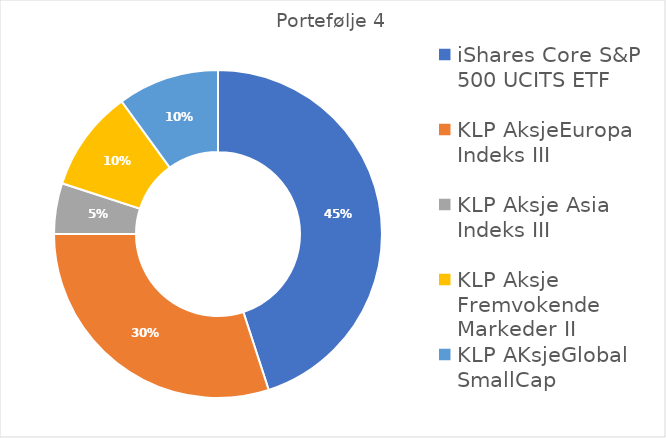
| Category | Series 0 |
|---|---|
| iShares Core S&P 500 UCITS ETF | 0.45 |
| KLP AksjeEuropa Indeks III | 0.3 |
| KLP Aksje Asia Indeks III  | 0.05 |
| KLP Aksje Fremvokende Markeder II | 0.1 |
| KLP AKsjeGlobal SmallCap  | 0.1 |